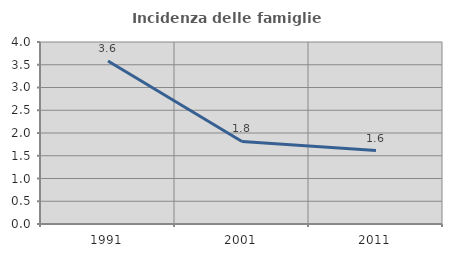
| Category | Incidenza delle famiglie numerose |
|---|---|
| 1991.0 | 3.582 |
| 2001.0 | 1.813 |
| 2011.0 | 1.613 |